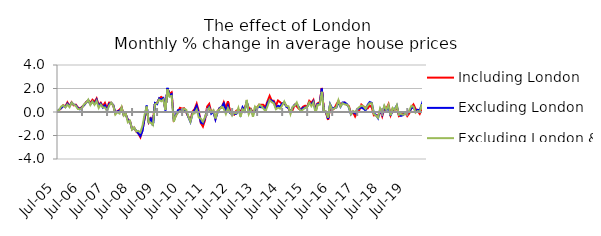
| Category | Including London | Excluding London | Excluding London & SE |
|---|---|---|---|
| 2005-07-01 | 0.014 | -0.006 | 0.09 |
| 2005-08-01 | 0.163 | 0.204 | 0.162 |
| 2005-09-01 | 0.324 | 0.325 | 0.462 |
| 2005-10-01 | 0.577 | 0.533 | 0.574 |
| 2005-11-01 | 0.466 | 0.417 | 0.391 |
| 2005-12-01 | 0.812 | 0.711 | 0.637 |
| 2006-01-01 | 0.5 | 0.49 | 0.413 |
| 2006-02-01 | 0.828 | 0.794 | 0.795 |
| 2006-03-01 | 0.563 | 0.637 | 0.633 |
| 2006-04-01 | 0.621 | 0.57 | 0.521 |
| 2006-05-01 | 0.386 | 0.352 | 0.256 |
| 2006-06-01 | 0.291 | 0.226 | 0.232 |
| 2006-07-01 | 0.438 | 0.412 | 0.342 |
| 2006-08-01 | 0.591 | 0.577 | 0.661 |
| 2006-09-01 | 0.848 | 0.81 | 0.786 |
| 2006-10-01 | 0.979 | 1.005 | 1.049 |
| 2006-11-01 | 0.775 | 0.651 | 0.593 |
| 2006-12-01 | 1.037 | 0.905 | 0.892 |
| 2007-01-01 | 0.858 | 0.697 | 0.609 |
| 2007-02-01 | 1.157 | 1.043 | 0.936 |
| 2007-03-01 | 0.591 | 0.493 | 0.34 |
| 2007-04-01 | 0.791 | 0.71 | 0.625 |
| 2007-05-01 | 0.495 | 0.385 | 0.394 |
| 2007-06-01 | 0.773 | 0.572 | 0.376 |
| 2007-07-01 | 0.314 | 0.122 | 0.088 |
| 2007-08-01 | 0.802 | 0.688 | 0.543 |
| 2007-09-01 | 0.779 | 0.781 | 0.791 |
| 2007-10-01 | 0.566 | 0.59 | 0.551 |
| 2007-11-01 | -0.121 | -0.088 | -0.213 |
| 2007-12-01 | 0.07 | 0.05 | -0.02 |
| 2008-01-01 | 0.193 | 0.09 | -0.129 |
| 2008-02-01 | 0.407 | 0.326 | 0.403 |
| 2008-03-01 | -0.27 | -0.262 | -0.309 |
| 2008-04-01 | -0.198 | -0.21 | -0.151 |
| 2008-05-01 | -0.666 | -0.685 | -0.88 |
| 2008-06-01 | -0.763 | -0.783 | -0.746 |
| 2008-07-01 | -1.456 | -1.471 | -1.501 |
| 2008-08-01 | -1.333 | -1.353 | -1.313 |
| 2008-09-01 | -1.666 | -1.602 | -1.648 |
| 2008-10-01 | -1.827 | -1.811 | -1.607 |
| 2008-11-01 | -2.152 | -2.056 | -1.731 |
| 2008-12-01 | -1.511 | -1.621 | -1.176 |
| 2009-01-01 | -0.593 | -0.517 | -0.245 |
| 2009-02-01 | 0.356 | 0.548 | 0.469 |
| 2009-03-01 | -0.862 | -0.838 | -0.892 |
| 2009-04-01 | -0.536 | -0.573 | -0.91 |
| 2009-05-01 | -0.786 | -1.169 | -1.113 |
| 2009-06-01 | 0.762 | 0.765 | 0.654 |
| 2009-07-01 | 0.77 | 0.668 | 0.757 |
| 2009-08-01 | 1.139 | 1.168 | 1.057 |
| 2009-09-01 | 1.284 | 1.066 | 0.915 |
| 2009-10-01 | 1.145 | 1.185 | 1.057 |
| 2009-11-01 | 0.204 | 0.132 | 0.175 |
| 2009-12-01 | 1.994 | 2.051 | 1.926 |
| 2010-01-01 | 1.536 | 1.399 | 1.297 |
| 2010-02-01 | 1.676 | 1.521 | 1.369 |
| 2010-03-01 | -0.651 | -0.718 | -0.827 |
| 2010-04-01 | -0.343 | -0.254 | -0.294 |
| 2010-05-01 | 0.049 | 0.144 | -0.074 |
| 2010-06-01 | 0.354 | 0.167 | 0.091 |
| 2010-07-01 | 0.283 | 0.116 | -0.045 |
| 2010-08-01 | 0.323 | 0.246 | 0.282 |
| 2010-09-01 | -0.047 | 0.051 | 0.181 |
| 2010-10-01 | -0.391 | -0.428 | -0.388 |
| 2010-11-01 | -0.701 | -0.847 | -0.825 |
| 2010-12-01 | 0.034 | -0.13 | -0.156 |
| 2011-01-01 | 0.244 | 0.162 | -0.115 |
| 2011-02-01 | 0.703 | 0.521 | 0.199 |
| 2011-03-01 | 0.059 | -0.093 | -0.469 |
| 2011-04-01 | -0.947 | -0.896 | -0.555 |
| 2011-05-01 | -1.241 | -0.98 | -0.829 |
| 2011-06-01 | -0.69 | -0.549 | -0.431 |
| 2011-07-01 | 0.458 | 0.212 | 0.054 |
| 2011-08-01 | 0.687 | 0.448 | 0.361 |
| 2011-09-01 | -0.023 | -0.142 | -0.013 |
| 2011-10-01 | 0.118 | 0.024 | 0.154 |
| 2011-11-01 | -0.58 | -0.635 | -0.549 |
| 2011-12-01 | 0.04 | -0.052 | 0.097 |
| 2012-01-01 | 0.333 | 0.333 | 0.235 |
| 2012-02-01 | 0.371 | 0.455 | 0.454 |
| 2012-03-01 | 0.836 | 0.719 | 0.266 |
| 2012-04-01 | 0.354 | 0.041 | -0.17 |
| 2012-05-01 | 0.924 | 0.531 | 0.33 |
| 2012-06-01 | -0.009 | -0.088 | -0.008 |
| 2012-07-01 | -0.101 | -0.157 | -0.313 |
| 2012-08-01 | -0.222 | -0.149 | -0.056 |
| 2012-09-01 | 0.107 | -0.167 | -0.111 |
| 2012-10-01 | 0.182 | 0.18 | 0.355 |
| 2012-11-01 | 0.049 | -0.244 | -0.405 |
| 2012-12-01 | 0.313 | 0.4 | 0.24 |
| 2013-01-01 | 0.306 | 0.087 | 0.068 |
| 2013-02-01 | 0.812 | 0.894 | 1.028 |
| 2013-03-01 | 0.345 | 0.054 | -0.185 |
| 2013-04-01 | 0.271 | 0.195 | 0.178 |
| 2013-05-01 | -0.069 | -0.184 | -0.413 |
| 2013-06-01 | 0.154 | 0.189 | 0.469 |
| 2013-07-01 | 0.387 | 0.362 | 0.318 |
| 2013-08-01 | 0.627 | 0.449 | 0.637 |
| 2013-09-01 | 0.614 | 0.397 | 0.507 |
| 2013-10-01 | 0.608 | 0.414 | 0.301 |
| 2013-11-01 | 0.433 | 0.181 | 0.067 |
| 2013-12-01 | 0.932 | 0.793 | 0.508 |
| 2014-01-01 | 1.371 | 1.039 | 1.01 |
| 2014-02-01 | 0.968 | 0.974 | 0.843 |
| 2014-03-01 | 0.953 | 0.835 | 0.729 |
| 2014-04-01 | 0.53 | 0.345 | 0.232 |
| 2014-05-01 | 0.977 | 0.529 | 0.368 |
| 2014-06-01 | 0.841 | 0.457 | 0.28 |
| 2014-07-01 | 0.675 | 0.715 | 0.55 |
| 2014-08-01 | 0.759 | 0.82 | 0.894 |
| 2014-09-01 | 0.533 | 0.443 | 0.501 |
| 2014-10-01 | 0.322 | 0.36 | 0.496 |
| 2014-11-01 | -0.008 | -0.021 | -0.17 |
| 2014-12-01 | 0.156 | 0.384 | 0.434 |
| 2015-01-01 | 0.598 | 0.617 | 0.551 |
| 2015-02-01 | 0.48 | 0.685 | 0.811 |
| 2015-03-01 | 0.272 | 0.423 | 0.331 |
| 2015-04-01 | 0.21 | 0.118 | 0.074 |
| 2015-05-01 | 0.449 | 0.351 | 0.211 |
| 2015-06-01 | 0.537 | 0.353 | 0.352 |
| 2015-07-01 | 0.463 | 0.465 | 0.426 |
| 2015-08-01 | 0.947 | 0.741 | 0.809 |
| 2015-09-01 | 0.767 | 0.655 | 0.494 |
| 2015-10-01 | 1.027 | 0.909 | 0.799 |
| 2015-11-01 | 0.191 | 0.085 | -0.057 |
| 2015-12-01 | 0.742 | 0.676 | 0.617 |
| 2016-01-01 | 0.805 | 0.681 | 0.612 |
| 2016-02-01 | 2.049 | 1.995 | 1.717 |
| 2016-03-01 | 0.139 | 0.043 | 0.039 |
| 2016-04-01 | -0.033 | 0.019 | 0.047 |
| 2016-05-01 | -0.677 | -0.587 | -0.483 |
| 2016-06-01 | 0.364 | 0.673 | 0.627 |
| 2016-07-01 | 0.169 | 0.309 | 0.195 |
| 2016-08-01 | 0.3 | 0.345 | 0.303 |
| 2016-09-01 | 0.633 | 0.377 | 0.395 |
| 2016-10-01 | 0.948 | 0.834 | 1.008 |
| 2016-11-01 | 0.616 | 0.446 | 0.473 |
| 2016-12-01 | 0.749 | 0.812 | 0.741 |
| 2017-01-01 | 0.808 | 0.802 | 0.649 |
| 2017-02-01 | 0.604 | 0.688 | 0.644 |
| 2017-03-01 | 0.501 | 0.389 | 0.426 |
| 2017-04-01 | -0.081 | -0.197 | -0.192 |
| 2017-05-01 | -0.038 | 0.018 | 0.084 |
| 2017-06-01 | -0.387 | -0.117 | -0.018 |
| 2017-07-01 | -0.049 | 0.194 | 0.262 |
| 2017-08-01 | 0.161 | 0.324 | 0.42 |
| 2017-09-01 | 0.631 | 0.378 | 0.54 |
| 2017-10-01 | 0.465 | 0.291 | 0.497 |
| 2017-11-01 | 0.38 | 0.138 | 0.262 |
| 2017-12-01 | 0.306 | 0.611 | 0.544 |
| 2018-01-01 | 0.546 | 0.845 | 0.735 |
| 2018-02-01 | 0.383 | 0.778 | 0.741 |
| 2018-03-01 | -0.286 | -0.128 | -0.179 |
| 2018-04-01 | -0.269 | -0.244 | -0.297 |
| 2018-05-01 | -0.322 | -0.529 | -0.491 |
| 2018-06-01 | 0.146 | 0.189 | 0.303 |
| 2018-07-01 | -0.37 | -0.221 | -0.081 |
| 2018-08-01 | 0.285 | 0.453 | 0.544 |
| 2018-09-01 | 0.297 | 0.134 | 0.197 |
| 2018-10-01 | 0.665 | 0.476 | 0.595 |
| 2018-11-01 | -0.272 | -0.333 | -0.287 |
| 2018-12-01 | 0.186 | 0.247 | 0.345 |
| 2019-01-01 | 0.178 | 0.25 | 0.149 |
| 2019-02-01 | 0.431 | 0.554 | 0.573 |
| 2019-03-01 | -0.351 | -0.23 | -0.233 |
| 2019-04-01 | -0.248 | -0.33 | -0.173 |
| 2019-05-01 | -0.049 | -0.263 | -0.235 |
| 2019-06-01 | -0.009 | -0.071 | -0.169 |
| 2019-07-01 | -0.346 | -0.078 | -0.055 |
| 2019-08-01 | -0.114 | 0.034 | 0.139 |
| 2019-09-01 | 0.394 | 0.313 | 0.528 |
| 2019-10-01 | 0.644 | 0.409 | 0.445 |
| 2019-11-01 | 0.262 | 0.058 | -0.056 |
| 2019-12-01 | 0.094 | 0.193 | 0.081 |
| 2020-01-01 | -0.162 | 0.139 | 0.015 |
| 2020-02-01 | 0.205 | 0.671 | 0.662 |
| 2020-03-01 | -0.141 | 0.004 | -0.281 |
| 2020-04-01 | 0.15 | 0.135 | -0.147 |